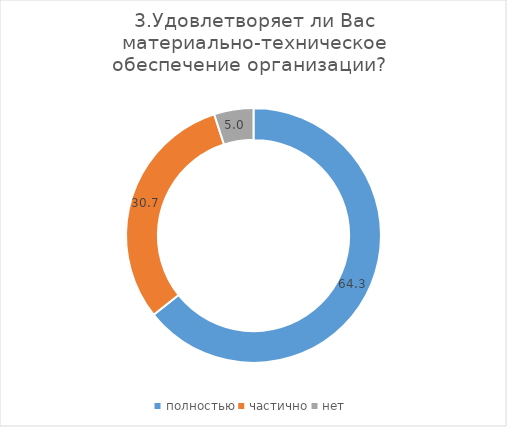
| Category | Series 0 |
|---|---|
| полностью | 64.329 |
| частично | 30.682 |
| нет | 4.989 |